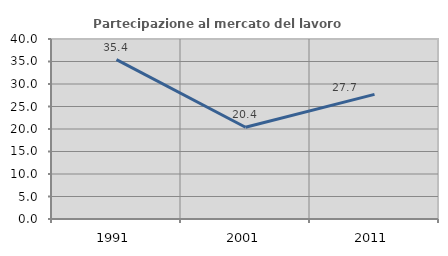
| Category | Partecipazione al mercato del lavoro  femminile |
|---|---|
| 1991.0 | 35.408 |
| 2001.0 | 20.398 |
| 2011.0 | 27.701 |